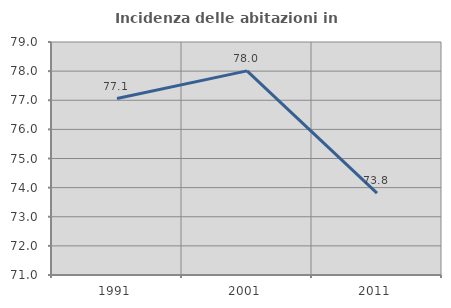
| Category | Incidenza delle abitazioni in proprietà  |
|---|---|
| 1991.0 | 77.057 |
| 2001.0 | 78.008 |
| 2011.0 | 73.81 |